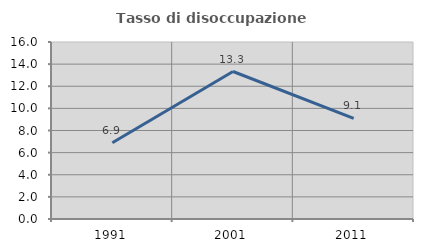
| Category | Tasso di disoccupazione giovanile  |
|---|---|
| 1991.0 | 6.897 |
| 2001.0 | 13.333 |
| 2011.0 | 9.091 |